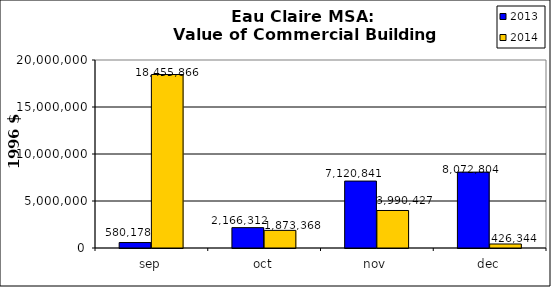
| Category | 2013 | 2014 |
|---|---|---|
| sep | 580178 | 18455866 |
| oct | 2166312 | 1873368 |
| nov | 7120841 | 3990427 |
| dec | 8072804 | 426344.102 |